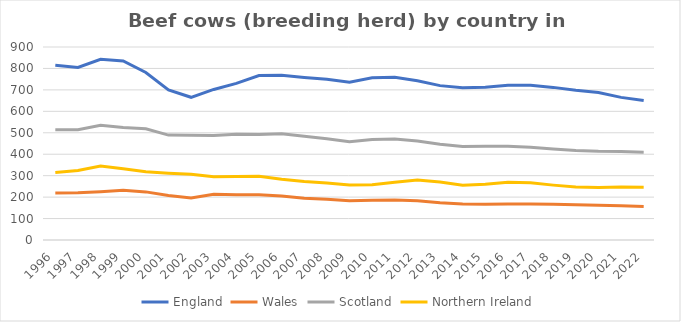
| Category | England | Wales | Scotland | Northern Ireland  |
|---|---|---|---|---|
| 1996.0 | 814.613 | 219 | 514.53 | 315 |
| 1997.0 | 804.449 | 220 | 513.75 | 324 |
| 1998.0 | 842.807 | 225.343 | 534.52 | 345 |
| 1999.0 | 835.167 | 232.214 | 524.754 | 332 |
| 2000.0 | 781.255 | 224.373 | 518.597 | 317.959 |
| 2001.0 | 700.168 | 207.22 | 489.074 | 311.819 |
| 2002.0 | 665.465 | 195.779 | 488.789 | 307.011 |
| 2003.0 | 702.129 | 212.895 | 487.133 | 295.447 |
| 2004.0 | 730.187 | 210.699 | 492.873 | 296.169 |
| 2005.0 | 767.112 | 210.821 | 492.319 | 296.858 |
| 2006.0 | 768.335 | 204.788 | 494.989 | 283.032 |
| 2007.0 | 758.177 | 195.126 | 483.365 | 272.616 |
| 2008.0 | 749.785 | 189.519 | 472.542 | 265.663 |
| 2009.0 | 735.399 | 182.564 | 458.169 | 256.776 |
| 2010.0 | 756.305 | 185.818 | 468.413 | 257.648 |
| 2011.0 | 759.094 | 186.824 | 471.291 | 269.488 |
| 2012.0 | 742.26 | 183.351 | 461.688 | 279.195 |
| 2013.0 | 719.864 | 174.1 | 446.945 | 270.105 |
| 2014.0 | 710.282 | 167.799 | 436.526 | 254.87 |
| 2015.0 | 712.552 | 166.692 | 436.766 | 260.325 |
| 2016.0 | 721.158 | 168.088 | 436.64 | 269.746 |
| 2017.0 | 721.383 | 167.828 | 432.812 | 267.1 |
| 2018.0 | 711.69 | 166.607 | 424.3 | 255.9 |
| 2019.0 | 698.586 | 163.817 | 417.4 | 247 |
| 2020.0 | 688 | 162 | 414 | 245 |
| 2021.0 | 665 | 160 | 413 | 247 |
| 2022.0 | 650.836 | 156.7 | 409.213 | 246.24 |